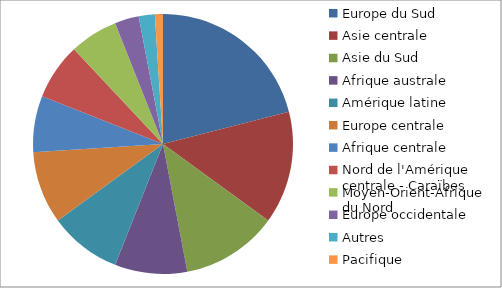
| Category | Series 0 |
|---|---|
| Europe du Sud | 0.21 |
| Asie centrale | 0.14 |
| Asie du Sud | 0.12 |
| Afrique australe | 0.09 |
| Amérique latine | 0.09 |
| Europe centrale | 0.09 |
| Afrique centrale | 0.07 |
| Nord de l'Amérique centrale - Caraïbes | 0.07 |
| Moyen-Orient-Afrique du Nord | 0.06 |
| Europe occidentale | 0.03 |
| Autres | 0.02 |
| Pacifique | 0.01 |